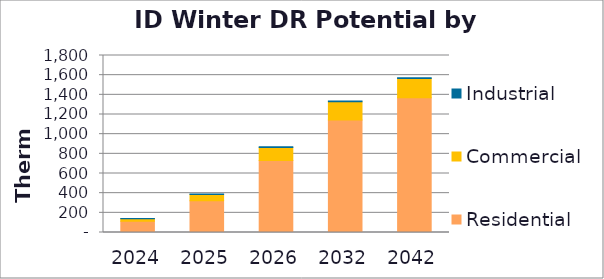
| Category | Residential | Commercial | Industrial |
|---|---|---|---|
| 2024.0 | 114.854 | 25.746 | 2.037 |
| 2025.0 | 323.611 | 64.038 | 4.072 |
| 2026.0 | 732.769 | 132.409 | 6.924 |
| 2032.0 | 1145.138 | 183.69 | 8.166 |
| 2042.0 | 1370.958 | 195.495 | 8.198 |